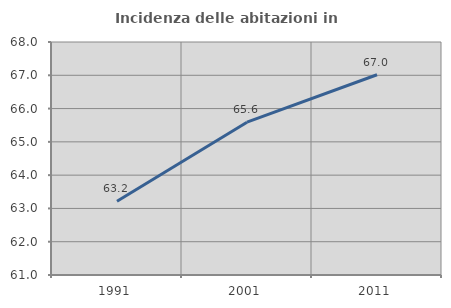
| Category | Incidenza delle abitazioni in proprietà  |
|---|---|
| 1991.0 | 63.215 |
| 2001.0 | 65.59 |
| 2011.0 | 67.016 |